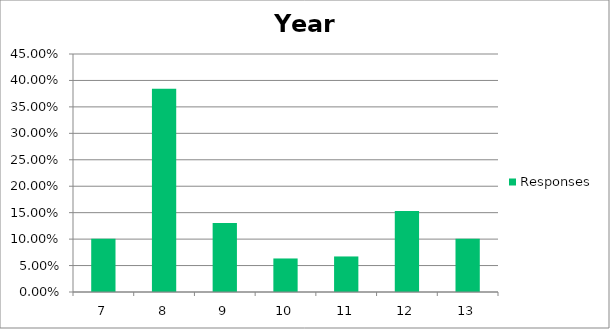
| Category | Responses |
|---|---|
| 7 | 0.101 |
| 8 | 0.384 |
| 9 | 0.131 |
| 10 | 0.063 |
| 11 | 0.067 |
| 12 | 0.153 |
| 13 | 0.101 |